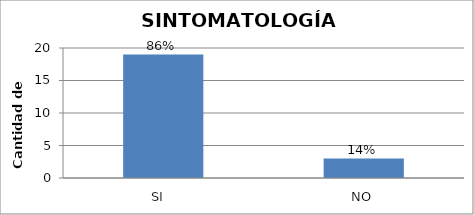
| Category | Candidad De Personas |
|---|---|
| SI   | 19 |
| NO | 3 |